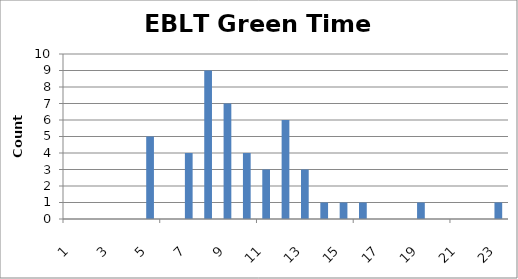
| Category | Series 0 |
|---|---|
| 0 | 0 |
| 1 | 0 |
| 2 | 0 |
| 3 | 0 |
| 4 | 5 |
| 5 | 0 |
| 6 | 4 |
| 7 | 9 |
| 8 | 7 |
| 9 | 4 |
| 10 | 3 |
| 11 | 6 |
| 12 | 3 |
| 13 | 1 |
| 14 | 1 |
| 15 | 1 |
| 16 | 0 |
| 17 | 0 |
| 18 | 1 |
| 19 | 0 |
| 20 | 0 |
| 21 | 0 |
| 22 | 1 |